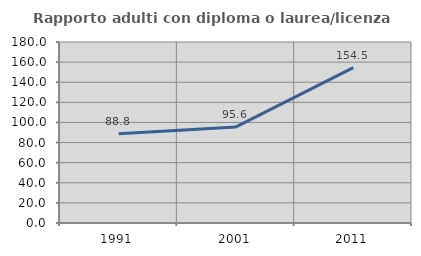
| Category | Rapporto adulti con diploma o laurea/licenza media  |
|---|---|
| 1991.0 | 88.785 |
| 2001.0 | 95.588 |
| 2011.0 | 154.545 |